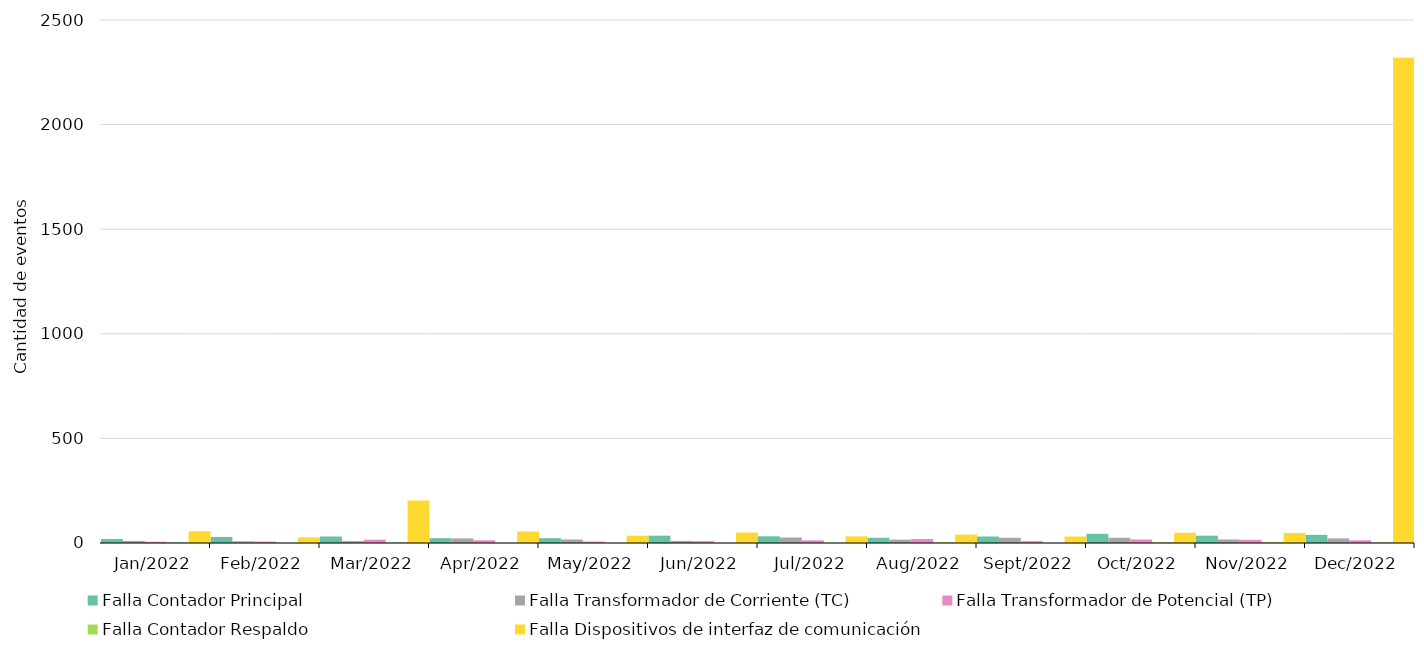
| Category | Falla Contador Principal | Falla Transformador de Corriente (TC) | Falla Transformador de Potencial (TP) | Falla Contador Respaldo | Falla Dispositivos de interfaz de comunicación |
|---|---|---|---|---|---|
| 2022-01-01 | 19 | 10 | 6 | 2 | 56 |
| 2022-02-01 | 29 | 8 | 7 | 1 | 27 |
| 2022-03-01 | 31 | 9 | 16 | 2 | 203 |
| 2022-04-01 | 23 | 22 | 13 | 0 | 55 |
| 2022-05-01 | 23 | 17 | 7 | 1 | 35 |
| 2022-06-01 | 35 | 10 | 9 | 1 | 50 |
| 2022-07-01 | 32 | 26 | 13 | 1 | 32 |
| 2022-08-01 | 25 | 16 | 19 | 3 | 40 |
| 2022-09-01 | 31 | 25 | 9 | 0 | 31 |
| 2022-10-01 | 44 | 25 | 17 | 3 | 49 |
| 2022-11-01 | 35 | 17 | 15 | 4 | 48 |
| 2022-12-01 | 39 | 22 | 13 | 2 | 2319 |